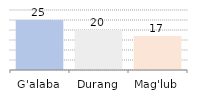
| Category | Series 0 |
|---|---|
| G'alaba | 25 |
| Durang | 20 |
| Mag'lub | 17 |